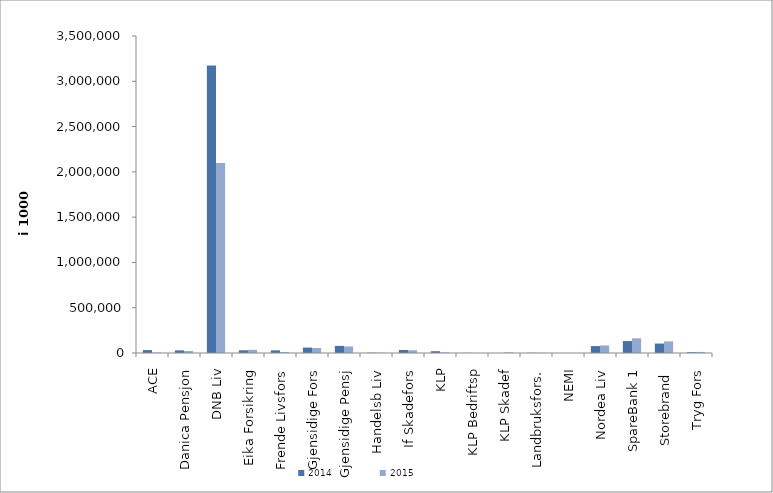
| Category | 2014 | 2015 |
|---|---|---|
| ACE | 32256.006 | 4749.243 |
| Danica Pensjon | 28834.788 | 21906.855 |
| DNB Liv | 3173243 | 2098027 |
| Eika Forsikring | 30082 | 34634 |
| Frende Livsfors | 29548 | 10344 |
| Gjensidige Fors | 59578 | 55314 |
| Gjensidige Pensj | 78359.327 | 72471 |
| Handelsb Liv | 2999 | 2739 |
| If Skadefors | 33375.982 | 30210.171 |
| KLP | 19592 | 6252.7 |
| KLP Bedriftsp | 1672 | 0 |
| KLP Skadef | 0 | 6485 |
| Landbruksfors. | 2331 | 2270 |
| NEMI | 0 | 0 |
| Nordea Liv | 76501 | 83372.505 |
| SpareBank 1 | 131640.167 | 162186.325 |
| Storebrand  | 104057.495 | 128440.825 |
| Tryg Fors | 8832.8 | 11707.462 |